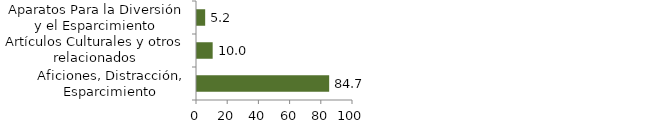
| Category | Cultura, diversión y esparcimiento |
|---|---|
| Aficiones, Distracción, Esparcimiento | 84.722 |
| Artículos Culturales y otros relacionados | 10.044 |
| Aparatos Para la Diversión y el Esparcimiento | 5.235 |